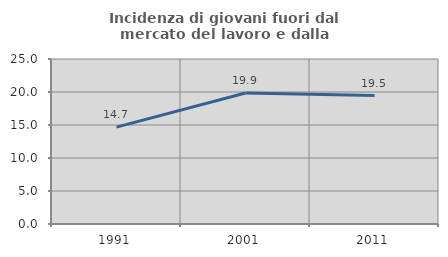
| Category | Incidenza di giovani fuori dal mercato del lavoro e dalla formazione  |
|---|---|
| 1991.0 | 14.673 |
| 2001.0 | 19.859 |
| 2011.0 | 19.469 |